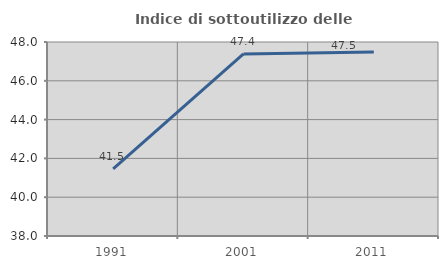
| Category | Indice di sottoutilizzo delle abitazioni  |
|---|---|
| 1991.0 | 41.463 |
| 2001.0 | 47.383 |
| 2011.0 | 47.48 |